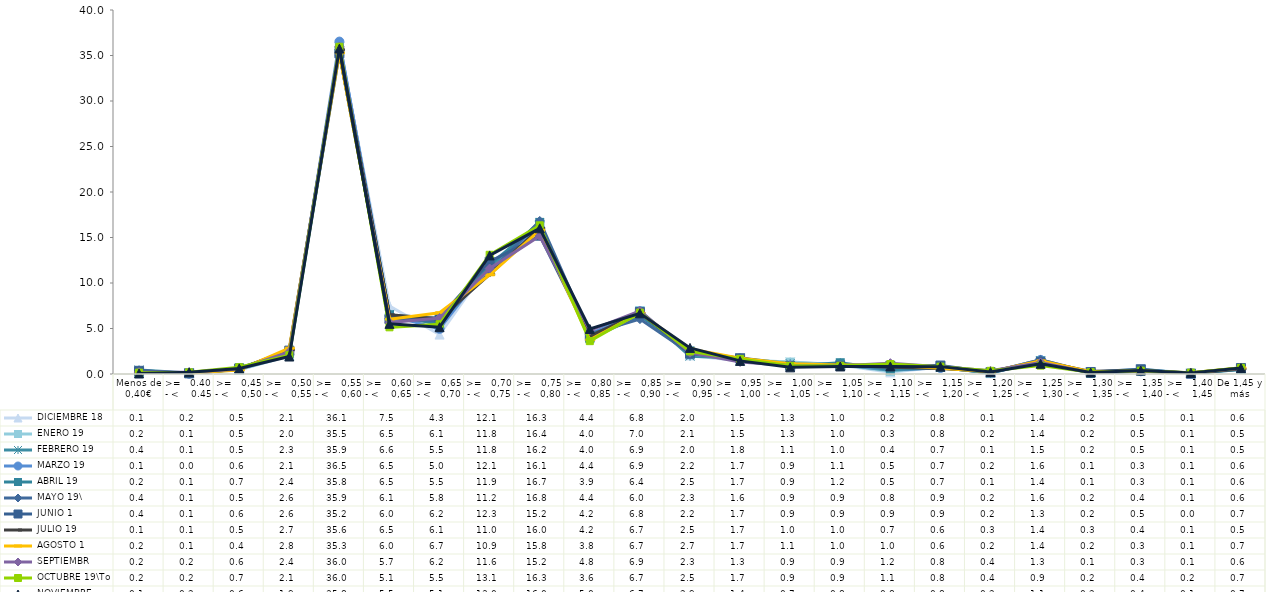
| Category |  DICIEMBRE 18 |  ENERO 19 |  FEBRERO 19 |  MARZO 19 |  ABRIL 19 |  MAYO 19\ |  JUNIO 1 |  JULIO 19 |  AGOSTO 1 |  SEPTIEMBR |  OCTUBRE 19\To |  NOVIEMBRE  |
|---|---|---|---|---|---|---|---|---|---|---|---|---|
| Menos de 0,40€ | 0.07 | 0.2 | 0.44 | 0.13 | 0.18 | 0.39 | 0.35 | 0.14 | 0.16 | 0.2 | 0.15 | 0.06 |
| >=   0.40 - <    0.45 | 0.18 | 0.08 | 0.12 | 0.03 | 0.06 | 0.05 | 0.07 | 0.09 | 0.11 | 0.18 | 0.18 | 0.19 |
| >=   0,45 - <    0,50 | 0.47 | 0.46 | 0.52 | 0.56 | 0.68 | 0.52 | 0.6 | 0.53 | 0.44 | 0.56 | 0.74 | 0.61 |
| >=   0,50 - <    0,55 | 2.08 | 2 | 2.28 | 2.09 | 2.36 | 2.64 | 2.57 | 2.65 | 2.84 | 2.43 | 2.07 | 1.92 |
| >=   0,55 - <    0,60 | 36.11 | 35.5 | 35.91 | 36.53 | 35.75 | 35.85 | 35.24 | 35.64 | 35.29 | 35.98 | 35.96 | 35.76 |
| >=   0,60 - <    0,65 | 7.48 | 6.48 | 6.55 | 6.45 | 6.51 | 6.08 | 6.02 | 6.5 | 6.02 | 5.65 | 5.13 | 5.51 |
| >=   0,65 - <   0,70 | 4.33 | 6.09 | 5.48 | 4.96 | 5.48 | 5.82 | 6.17 | 6.06 | 6.73 | 6.15 | 5.47 | 5.14 |
| >=   0,70 - <   0,75 | 12.14 | 11.8 | 11.8 | 12.07 | 11.94 | 11.15 | 12.34 | 10.95 | 10.9 | 11.59 | 13.1 | 13.03 |
| >=   0,75 - <   0,80 | 16.26 | 16.37 | 16.24 | 16.05 | 16.66 | 16.82 | 15.2 | 16.01 | 15.81 | 15.17 | 16.34 | 16.01 |
| >=   0,80 - <   0,85 | 4.4 | 4.02 | 4.03 | 4.37 | 3.89 | 4.39 | 4.15 | 4.17 | 3.76 | 4.8 | 3.61 | 4.95 |
| >=   0,85 - <   0,90 | 6.84 | 6.98 | 6.85 | 6.9 | 6.39 | 6.03 | 6.8 | 6.7 | 6.69 | 6.93 | 6.74 | 6.67 |
| >=   0,90 - <    0,95 | 2.04 | 2.1 | 1.96 | 2.19 | 2.54 | 2.29 | 2.23 | 2.54 | 2.74 | 2.34 | 2.48 | 2.87 |
| >=   0,95 - <   1,00 | 1.45 | 1.54 | 1.76 | 1.7 | 1.69 | 1.55 | 1.73 | 1.74 | 1.72 | 1.32 | 1.66 | 1.44 |
| >=   1,00 - <   1,05 | 1.33 | 1.31 | 1.14 | 0.93 | 0.88 | 0.85 | 0.89 | 1.01 | 1.13 | 0.93 | 0.9 | 0.73 |
| >=   1,05 - <    1,10 | 0.95 | 1.02 | 1.01 | 1.08 | 1.24 | 0.86 | 0.89 | 1 | 0.99 | 0.9 | 0.91 | 0.83 |
| >=   1,10 - <   1,15 | 0.18 | 0.29 | 0.42 | 0.48 | 0.46 | 0.78 | 0.9 | 0.73 | 1 | 1.19 | 1.09 | 0.83 |
| >=   1,15 - <    1,20 | 0.78 | 0.79 | 0.71 | 0.66 | 0.73 | 0.86 | 0.93 | 0.6 | 0.63 | 0.79 | 0.81 | 0.81 |
| >=   1,20 - <    1,25 | 0.09 | 0.2 | 0.12 | 0.19 | 0.11 | 0.21 | 0.2 | 0.29 | 0.24 | 0.35 | 0.35 | 0.21 |
| >=   1,25 - <    1,30 | 1.43 | 1.43 | 1.46 | 1.55 | 1.41 | 1.55 | 1.29 | 1.39 | 1.44 | 1.27 | 0.92 | 1.12 |
| >=   1,30 - <    1,35 | 0.15 | 0.18 | 0.18 | 0.11 | 0.09 | 0.17 | 0.22 | 0.29 | 0.24 | 0.14 | 0.2 | 0.16 |
| >=   1,35 - <    1,40 | 0.45 | 0.53 | 0.46 | 0.3 | 0.33 | 0.36 | 0.52 | 0.35 | 0.29 | 0.32 | 0.37 | 0.38 |
| >=   1,40 - <    1,45 | 0.12 | 0.08 | 0.06 | 0.07 | 0.06 | 0.11 | 0.03 | 0.09 | 0.13 | 0.14 | 0.15 | 0.12 |
| De 1,45 y más | 0.63 | 0.5 | 0.49 | 0.57 | 0.56 | 0.64 | 0.66 | 0.54 | 0.67 | 0.63 | 0.68 | 0.65 |